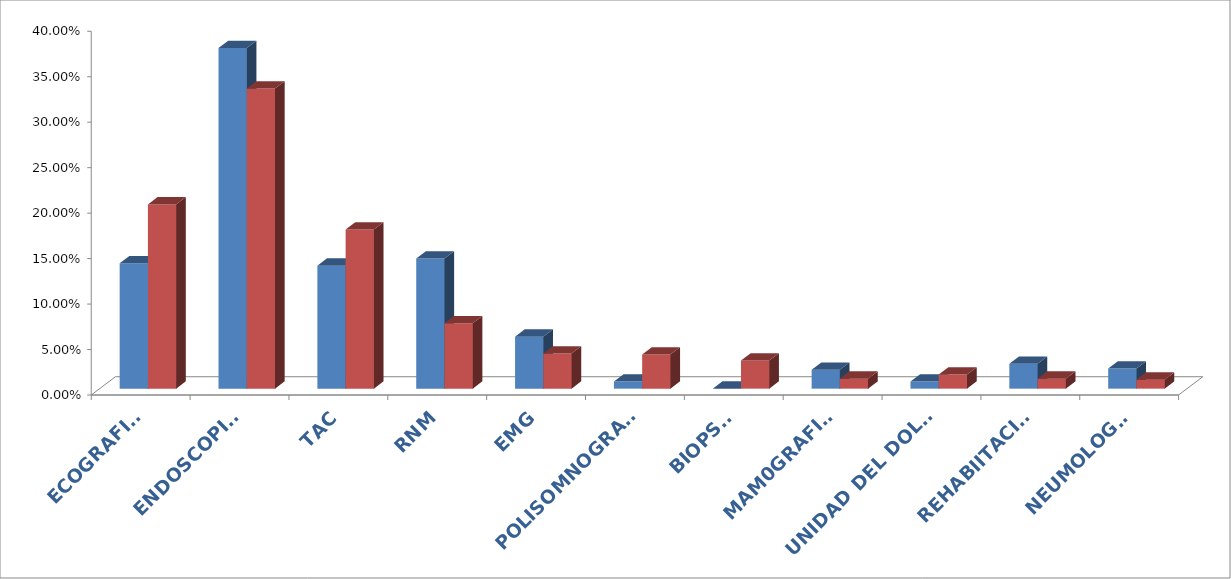
| Category | Series 0 | Series 1 |
|---|---|---|
| ECOGRAFIAS | 0.138 | 0.203 |
| ENDOSCOPIAS | 0.375 | 0.33 |
| TAC | 0.135 | 0.175 |
| RNM | 0.143 | 0.072 |
| EMG | 0.057 | 0.039 |
|  POLISOMNOGRAFIA | 0.008 | 0.038 |
| BIOPSIA | 0 | 0.031 |
| MAM0GRAFIAS | 0.021 | 0.011 |
| UNIDAD DEL DOLOR | 0.008 | 0.016 |
| REHABIITACIÓN | 0.027 | 0.011 |
| NEUMOLOGIA | 0.022 | 0.01 |